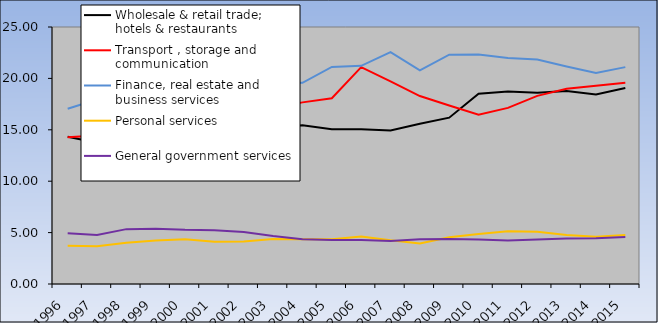
| Category | Wholesale & retail trade; hotels & restaurants | Transport , storage and communication | Finance, real estate and business services | Personal services | General government services |
|---|---|---|---|---|---|
| 1996.0 | 14.315 | 14.284 | 17.049 | 3.717 | 4.932 |
| 1997.0 | 13.743 | 14.442 | 17.942 | 3.677 | 4.777 |
| 1998.0 | 13.493 | 15.342 | 18.647 | 4.008 | 5.337 |
| 1999.0 | 13.518 | 15.999 | 20.453 | 4.223 | 5.377 |
| 2000.0 | 14.569 | 16.231 | 18.858 | 4.345 | 5.269 |
| 2001.0 | 14.937 | 15.741 | 17.818 | 4.111 | 5.231 |
| 2002.0 | 14.94 | 15.35 | 18.976 | 4.142 | 5.066 |
| 2003.0 | 15.196 | 17.129 | 19.48 | 4.374 | 4.662 |
| 2004.0 | 15.444 | 17.669 | 19.569 | 4.351 | 4.349 |
| 2005.0 | 15.049 | 18.064 | 21.114 | 4.364 | 4.287 |
| 2006.0 | 15.055 | 21.097 | 21.224 | 4.622 | 4.282 |
| 2007.0 | 14.936 | 19.718 | 22.548 | 4.246 | 4.175 |
| 2008.0 | 15.582 | 18.281 | 20.774 | 3.945 | 4.363 |
| 2009.0 | 16.181 | 17.369 | 22.311 | 4.547 | 4.385 |
| 2010.0 | 18.506 | 16.458 | 22.333 | 4.856 | 4.326 |
| 2011.0 | 18.731 | 17.135 | 21.974 | 5.125 | 4.239 |
| 2012.0 | 18.599 | 18.299 | 21.846 | 5.085 | 4.326 |
| 2013.0 | 18.767 | 18.991 | 21.161 | 4.777 | 4.416 |
| 2014.0 | 18.429 | 19.284 | 20.534 | 4.607 | 4.453 |
| 2015.0 | 19.061 | 19.578 | 21.095 | 4.763 | 4.576 |